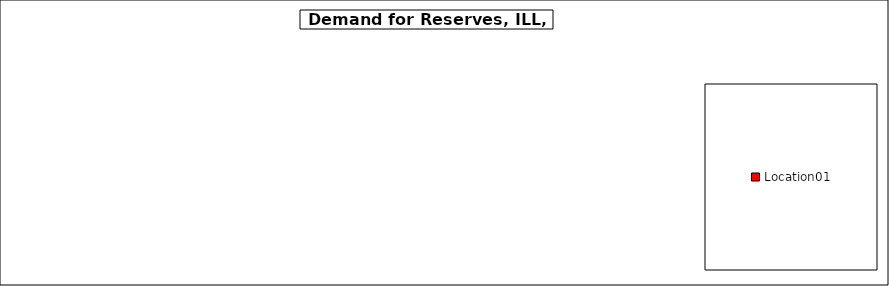
| Category | Location01 |
|---|---|
| Location01 | 0 |